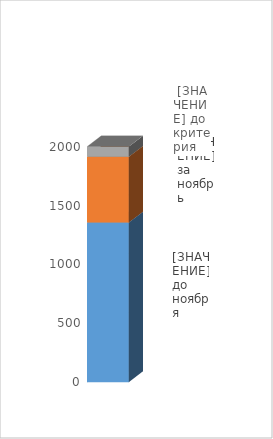
| Category | 1356 | Series 1 | Series 2 |
|---|---|---|---|
| 0 | 1356 | 558 | 86 |